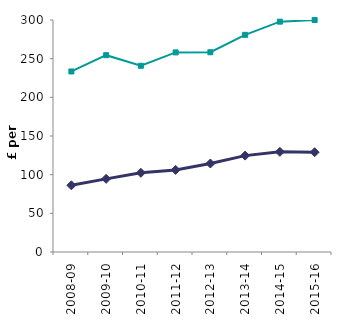
| Category | private rents | social rents |
|---|---|---|
| 2008-09 | 233.446 | 86.202 |
| 2009-10 | 254.496 | 94.572 |
| 2010-11 | 240.796 | 102.379 |
| 2011-12 | 258.112 | 106.166 |
| 2012-13 | 258.306 | 114.443 |
| 2013-14 | 280.803 | 124.64 |
| 2014-15 | 297.865 | 129.488 |
| 2015-16 | 299.915 | 129.002 |